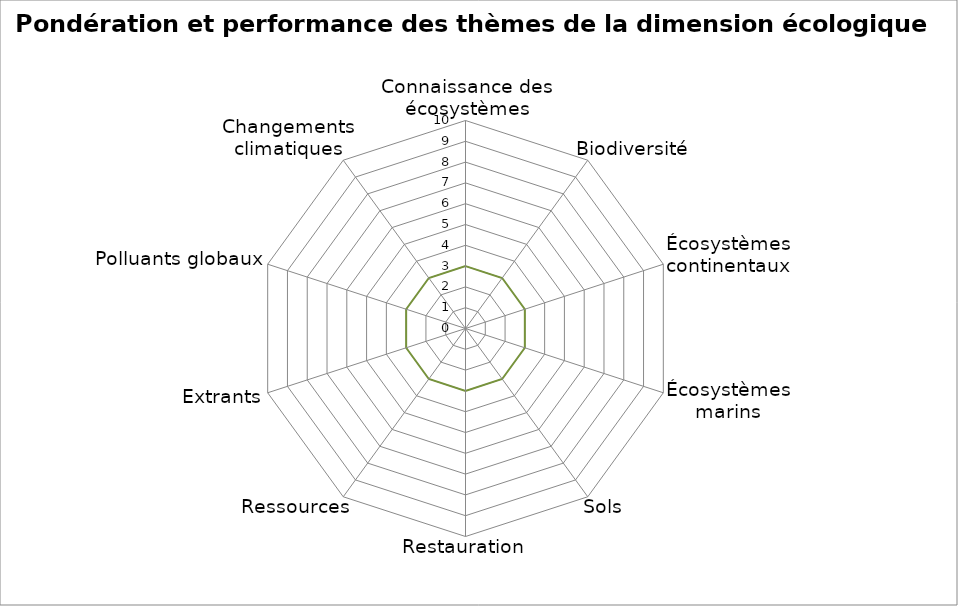
| Category | Performance | Pondération | Series 2 |
|---|---|---|---|
| Connaissance des écosystèmes | 0 | 0 | 3 |
| Biodiversité | 0 | 0 | 3 |
| Écosystèmes continentaux | 0 | 0 | 3 |
| Écosystèmes marins | 0 | 0 | 3 |
| Sols | 0 | 0 | 3 |
| Restauration | 0 | 0 | 3 |
| Ressources | 0 | 0 | 3 |
| Extrants | 0 | 0 | 3 |
| Polluants globaux | 0 | 0 | 3 |
| Changements climatiques | 0 | 0 | 3 |